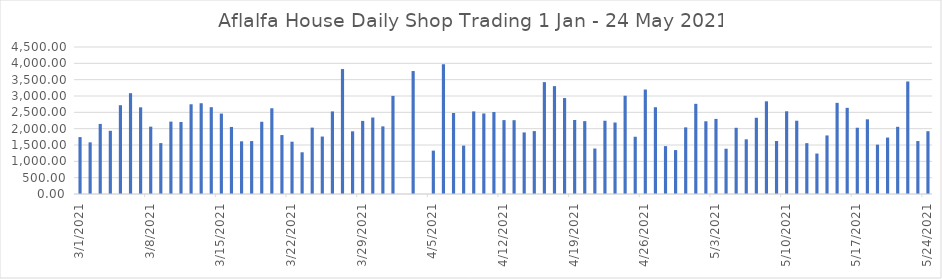
| Category | Series 0 |
|---|---|
| 3/1/21 | 1742.46 |
| 3/2/21 | 1581.34 |
| 3/3/21 | 2145.17 |
| 3/4/21 | 1934.13 |
| 3/5/21 | 2717.97 |
| 3/6/21 | 3086.33 |
| 3/7/21 | 2652.67 |
| 3/8/21 | 2061.44 |
| 3/9/21 | 1558.47 |
| 3/10/21 | 2215.61 |
| 3/11/21 | 2204.81 |
| 3/12/21 | 2746.61 |
| 3/13/21 | 2778.35 |
| 3/14/21 | 2657.26 |
| 3/15/21 | 2461.49 |
| 3/16/21 | 2052.27 |
| 3/17/21 | 1612.67 |
| 3/18/21 | 1619.9 |
| 3/19/21 | 2211.08 |
| 3/20/21 | 2624.47 |
| 3/21/21 | 1804.34 |
| 3/22/21 | 1600.96 |
| 3/23/21 | 1277.3 |
| 3/24/21 | 2032.17 |
| 3/25/21 | 1758.52 |
| 3/26/21 | 2527.55 |
| 3/27/21 | 3824.48 |
| 3/28/21 | 1918.72 |
| 3/29/21 | 2237.87 |
| 3/30/21 | 2341.13 |
| 3/31/21 | 2069.84 |
| 4/1/21 | 3003.74 |
| 4/2/21 | 0 |
| 4/3/21 | 3763.78 |
| 4/4/21 | 0 |
| 4/5/21 | 1327.87 |
| 4/6/21 | 3973.89 |
| 4/7/21 | 2479.47 |
| 4/8/21 | 1481.83 |
| 4/9/21 | 2528.47 |
| 4/10/21 | 2464.75 |
| 4/11/21 | 2508.85 |
| 4/12/21 | 2261.93 |
| 4/13/21 | 2259.62 |
| 4/14/21 | 1884.54 |
| 4/15/21 | 1926.14 |
| 4/16/21 | 3424.52 |
| 4/17/21 | 3302.34 |
| 4/18/21 | 2937.1 |
| 4/19/21 | 2264.94 |
| 4/20/21 | 2230.59 |
| 4/21/21 | 1391.81 |
| 4/22/21 | 2242.9 |
| 4/23/21 | 2188.38 |
| 4/24/21 | 3008.6 |
| 4/25/21 | 1752.57 |
| 4/26/21 | 3197.36 |
| 4/27/21 | 2656.18 |
| 4/28/21 | 1466.01 |
| 4/29/21 | 1344.12 |
| 4/30/21 | 2039.68 |
| 5/1/21 | 2760.38 |
| 5/2/21 | 2225.81 |
| 5/3/21 | 2298.78 |
| 5/4/21 | 1386.31 |
| 5/5/21 | 2026.92 |
| 5/6/21 | 1673.8 |
| 5/7/21 | 2334.5 |
| 5/8/21 | 2836.81 |
| 5/9/21 | 1623.18 |
| 5/10/21 | 2531.93 |
| 5/11/21 | 2243.35 |
| 5/12/21 | 1556.03 |
| 5/13/21 | 1238.74 |
| 5/14/21 | 1792.58 |
| 5/15/21 | 2789.7 |
| 5/16/21 | 2637.48 |
| 5/17/21 | 2028.85 |
| 5/18/21 | 2285.96 |
| 5/19/21 | 1510.56 |
| 5/20/21 | 1727.39 |
| 5/21/21 | 2056.88 |
| 5/22/21 | 3444.42 |
| 5/23/21 | 1620.91 |
| 5/24/21 | 1922.31 |